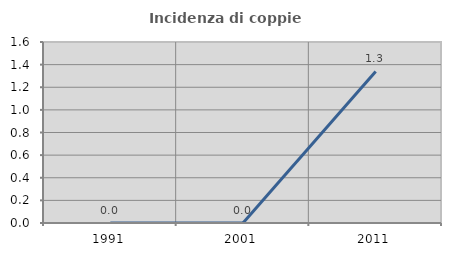
| Category | Incidenza di coppie miste |
|---|---|
| 1991.0 | 0 |
| 2001.0 | 0 |
| 2011.0 | 1.339 |